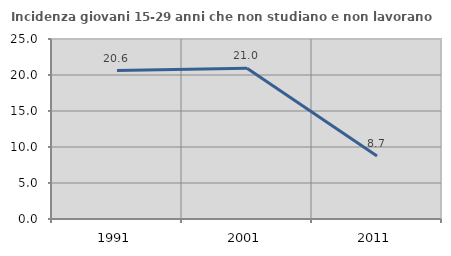
| Category | Incidenza giovani 15-29 anni che non studiano e non lavorano  |
|---|---|
| 1991.0 | 20.625 |
| 2001.0 | 20.952 |
| 2011.0 | 8.738 |